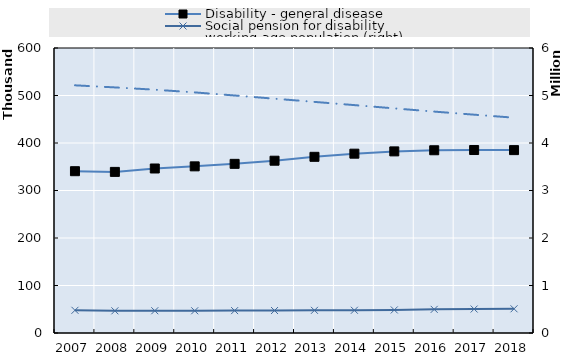
| Category | Disability - general disease | Social pension for disability |
|---|---|---|
| 2007.0 | 340635 | 47765 |
| 2008.0 | 339169 | 46699 |
| 2009.0 | 346318 | 46869 |
| 2010.0 | 350839 | 46795 |
| 2011.0 | 356110 | 47136 |
| 2012.0 | 362705 | 47307 |
| 2013.0 | 370902 | 47720 |
| 2014.0 | 377513 | 47893 |
| 2015.0 | 382339 | 48548 |
| 2016.0 | 384713 | 49793 |
| 2017.0 | 385226 | 50428 |
| 2018.0 | 385017 | 50948 |